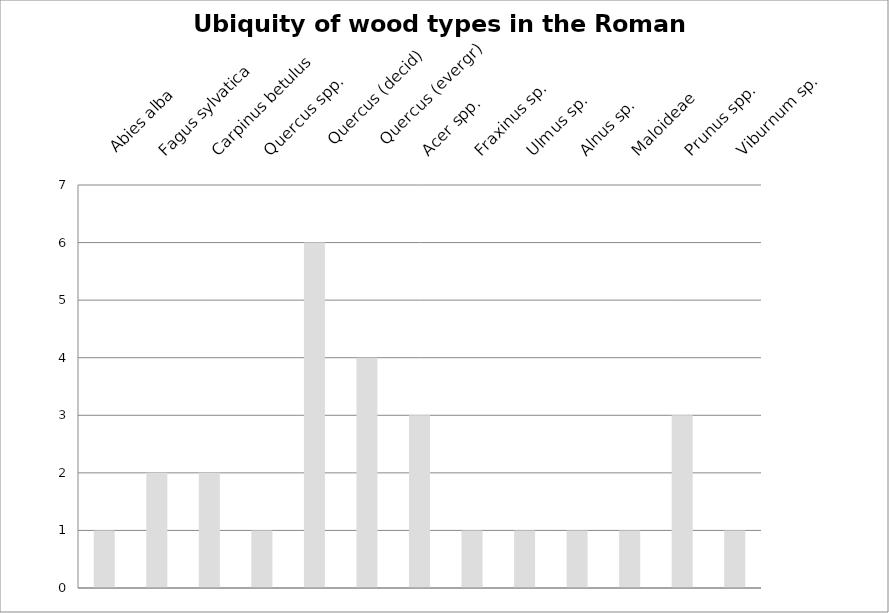
| Category | Series 0 |
|---|---|
|  Abies alba                   | 1 |
| Fagus sylvatica            | 2 |
| Carpinus betulus  | 2 |
| Quercus spp.  | 1 |
|    Quercus (decid) | 6 |
|    Quercus (evergr)    | 4 |
| Acer spp.                         | 3 |
| Fraxinus sp.    | 1 |
| Ulmus sp. | 1 |
| Alnus sp. | 1 |
| Maloideae  | 1 |
| Prunus spp.           | 3 |
| Viburnum sp. | 1 |